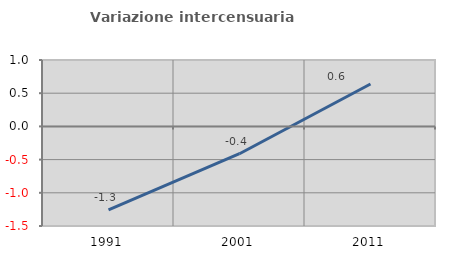
| Category | Variazione intercensuaria annua |
|---|---|
| 1991.0 | -1.258 |
| 2001.0 | -0.411 |
| 2011.0 | 0.639 |